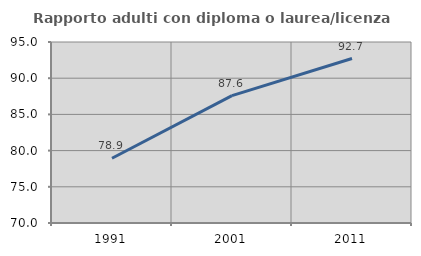
| Category | Rapporto adulti con diploma o laurea/licenza media  |
|---|---|
| 1991.0 | 78.947 |
| 2001.0 | 87.591 |
| 2011.0 | 92.715 |